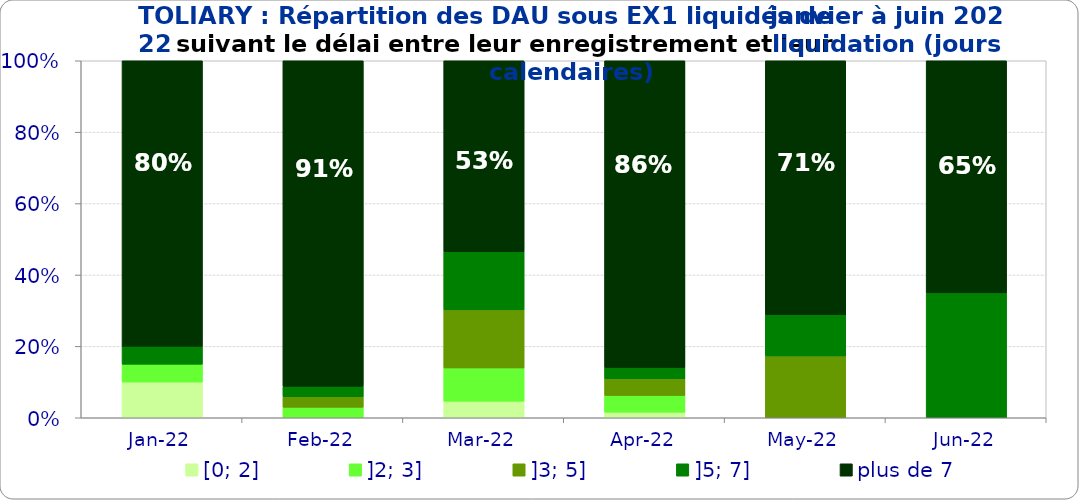
| Category | [0; 2] | ]2; 3] | ]3; 5] | ]5; 7] | plus de 7 |
|---|---|---|---|---|---|
| 2022-01-01 | 0.1 | 0.05 | 0 | 0.05 | 0.8 |
| 2022-02-01 | 0 | 0.029 | 0.029 | 0.029 | 0.912 |
| 2022-03-01 | 0.047 | 0.093 | 0.163 | 0.163 | 0.535 |
| 2022-04-01 | 0.016 | 0.047 | 0.047 | 0.031 | 0.859 |
| 2022-05-01 | 0 | 0 | 0.173 | 0.115 | 0.712 |
| 2022-06-01 | 0 | 0 | 0 | 0.35 | 0.65 |